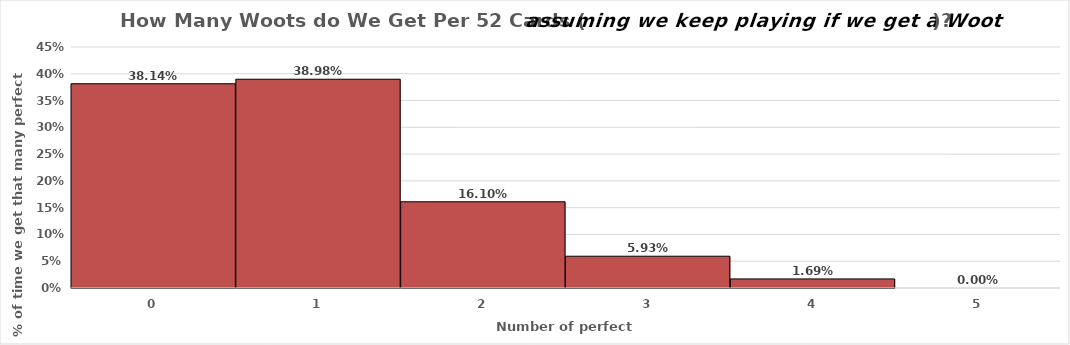
| Category | Series 1 |
|---|---|
| 0.0 | 0.381 |
| 1.0 | 0.39 |
| 2.0 | 0.161 |
| 3.0 | 0.059 |
| 4.0 | 0.017 |
| 5.0 | 0 |